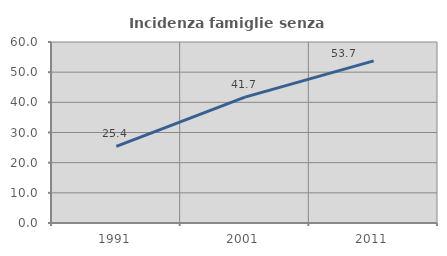
| Category | Incidenza famiglie senza nuclei |
|---|---|
| 1991.0 | 25.424 |
| 2001.0 | 41.732 |
| 2011.0 | 53.731 |